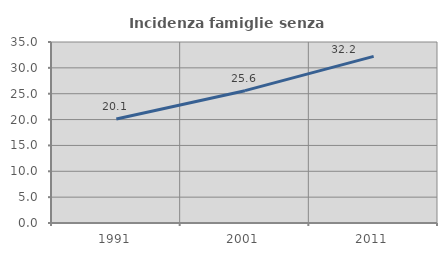
| Category | Incidenza famiglie senza nuclei |
|---|---|
| 1991.0 | 20.118 |
| 2001.0 | 25.589 |
| 2011.0 | 32.222 |